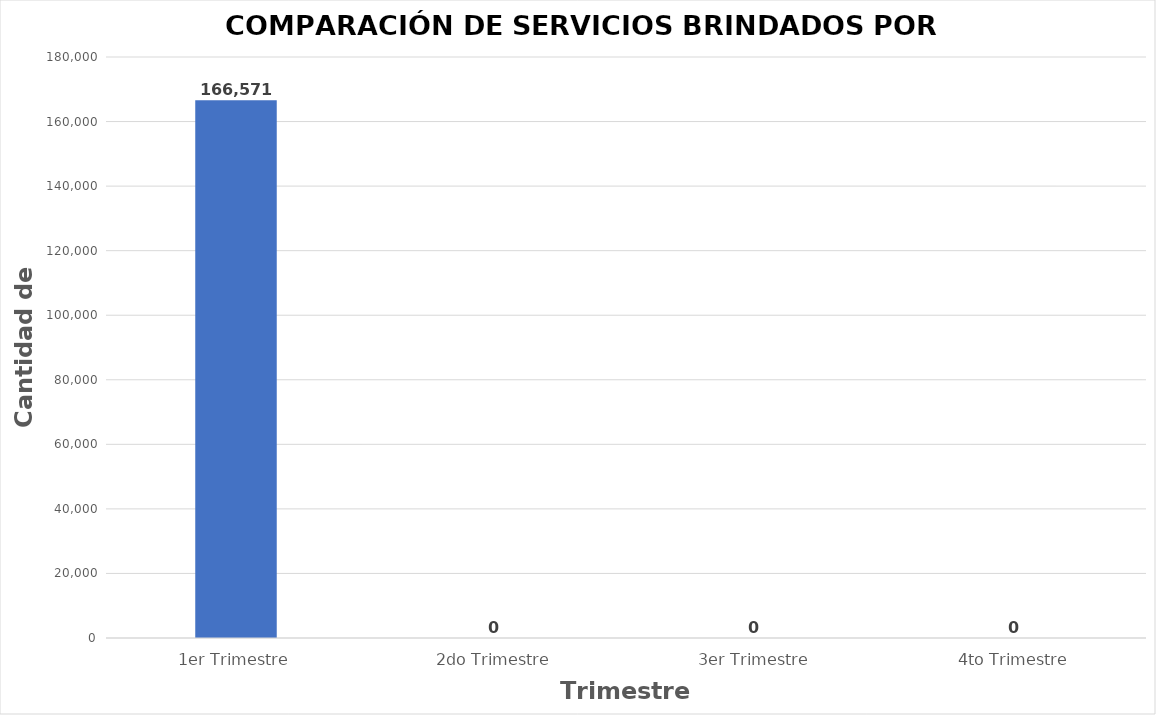
| Category | Series 0 |
|---|---|
| 1er Trimestre | 166571 |
| 2do Trimestre | 0 |
| 3er Trimestre | 0 |
| 4to Trimestre | 0 |